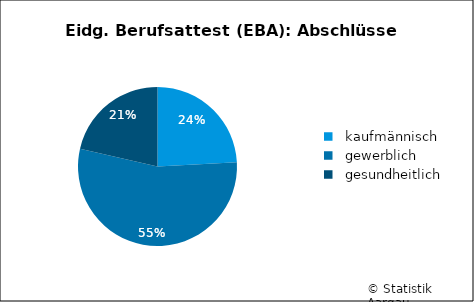
| Category | Series 0 |
|---|---|
|   kaufmännisch | 124 |
|   gewerblich | 280 |
|   gesundheitlich | 110 |